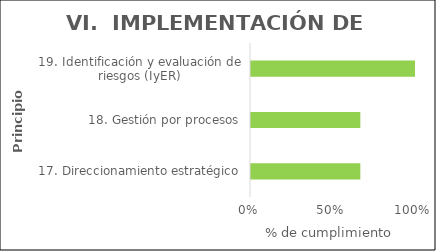
| Category | Principios |
|---|---|
| 17. Direccionamiento estratégico | 0.667 |
| 18. Gestión por procesos | 0.667 |
| 19. Identificación y evaluación de riesgos (IyER) | 1 |